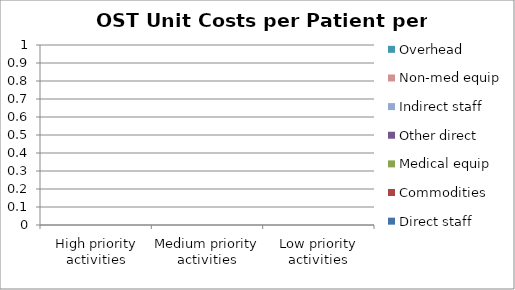
| Category | Direct staff | Commodities | Medical equip | Other direct | Indirect staff | Non-med equip | Overhead |
|---|---|---|---|---|---|---|---|
| High priority activities | 0 | 0 | 0 | 0 | 0 | 0 | 0 |
| Medium priority activities | 0 | 0 | 0 | 0 | 0 | 0 | 0 |
| Low priority activities | 0 | 0 | 0 | 0 | 0 | 0 | 0 |